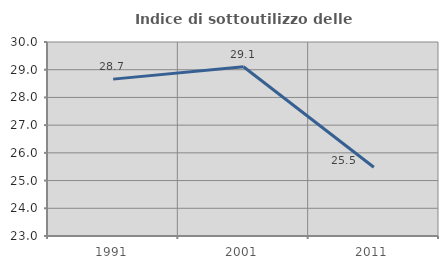
| Category | Indice di sottoutilizzo delle abitazioni  |
|---|---|
| 1991.0 | 28.66 |
| 2001.0 | 29.106 |
| 2011.0 | 25.479 |